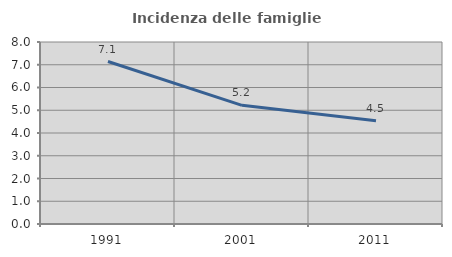
| Category | Incidenza delle famiglie numerose |
|---|---|
| 1991.0 | 7.143 |
| 2001.0 | 5.217 |
| 2011.0 | 4.541 |